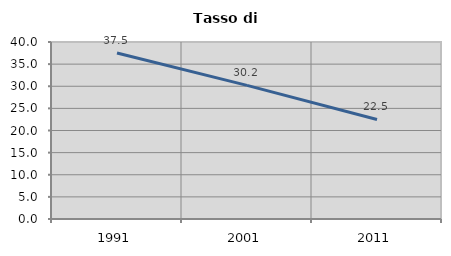
| Category | Tasso di disoccupazione   |
|---|---|
| 1991.0 | 37.5 |
| 2001.0 | 30.204 |
| 2011.0 | 22.5 |